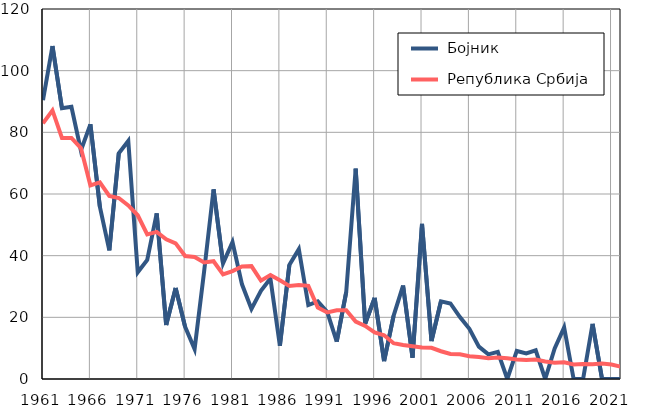
| Category |  Бојник |  Република Србија |
|---|---|---|
| 1961.0 | 90.4 | 82.9 |
| 1962.0 | 108 | 87.1 |
| 1963.0 | 87.8 | 78.2 |
| 1964.0 | 88.3 | 78.2 |
| 1965.0 | 74.1 | 74.9 |
| 1966.0 | 82.6 | 62.8 |
| 1967.0 | 55.9 | 63.8 |
| 1968.0 | 41.7 | 59.4 |
| 1969.0 | 73.2 | 58.7 |
| 1970.0 | 77.2 | 56.3 |
| 1971.0 | 34.6 | 53.1 |
| 1972.0 | 38.6 | 46.9 |
| 1973.0 | 53.7 | 47.7 |
| 1974.0 | 17.5 | 45.3 |
| 1975.0 | 29.5 | 44 |
| 1976.0 | 16.9 | 39.9 |
| 1977.0 | 9.7 | 39.6 |
| 1978.0 | 34.8 | 37.8 |
| 1979.0 | 61.5 | 38.2 |
| 1980.0 | 37.5 | 33.9 |
| 1981.0 | 44.4 | 35 |
| 1982.0 | 30.7 | 36.5 |
| 1983.0 | 22.7 | 36.6 |
| 1984.0 | 28.6 | 31.9 |
| 1985.0 | 32.6 | 33.7 |
| 1986.0 | 10.8 | 32 |
| 1987.0 | 37 | 30.2 |
| 1988.0 | 42.1 | 30.5 |
| 1989.0 | 24 | 30.2 |
| 1990.0 | 25.2 | 23.2 |
| 1991.0 | 21.7 | 21.6 |
| 1992.0 | 12.1 | 22.3 |
| 1993.0 | 28.2 | 22.3 |
| 1994.0 | 68.2 | 18.6 |
| 1995.0 | 17.9 | 17.2 |
| 1996.0 | 26.3 | 15.1 |
| 1997.0 | 5.8 | 14.2 |
| 1998.0 | 20.5 | 11.6 |
| 1999.0 | 30.3 | 11 |
| 2000.0 | 6.9 | 10.6 |
| 2001.0 | 50.3 | 10.2 |
| 2002.0 | 12.3 | 10.1 |
| 2003.0 | 25.2 | 9 |
| 2004.0 | 24.5 | 8.1 |
| 2005.0 | 20.1 | 8 |
| 2006.0 | 16.3 | 7.4 |
| 2007.0 | 10.5 | 7.1 |
| 2008.0 | 8 | 6.7 |
| 2009.0 | 8.8 | 7 |
| 2010.0 | 0 | 6.7 |
| 2011.0 | 9.1 | 6.3 |
| 2012.0 | 8.3 | 6.2 |
| 2013.0 | 9.3 | 6.3 |
| 2014.0 | 0 | 5.7 |
| 2015.0 | 9.9 | 5.3 |
| 2016.0 | 16.7 | 5.4 |
| 2017.0 | 0 | 4.7 |
| 2018.0 | 0 | 4.9 |
| 2019.0 | 17.9 | 4.8 |
| 2020.0 | 0 | 5 |
| 2021.0 | 0 | 4.7 |
| 2022.0 | 0 | 4 |